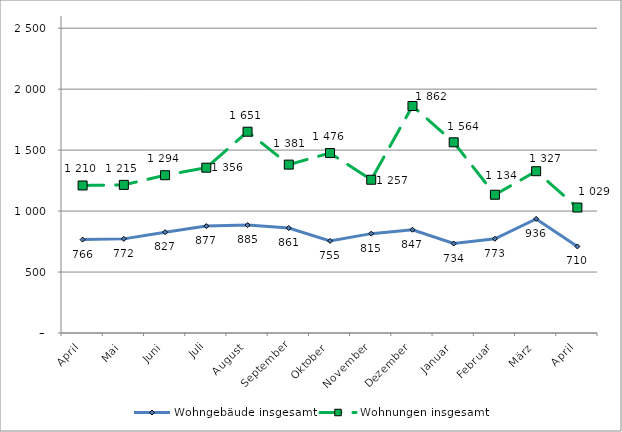
| Category | Wohngebäude insgesamt | Wohnungen insgesamt |
|---|---|---|
| April | 766 | 1210 |
| Mai | 772 | 1215 |
| Juni | 827 | 1294 |
| Juli | 877 | 1356 |
| August | 885 | 1651 |
| September | 861 | 1381 |
| Oktober | 755 | 1476 |
| November | 815 | 1257 |
| Dezember | 847 | 1862 |
| Januar | 734 | 1564 |
| Februar | 773 | 1134 |
| März | 936 | 1327 |
| April | 710 | 1029 |